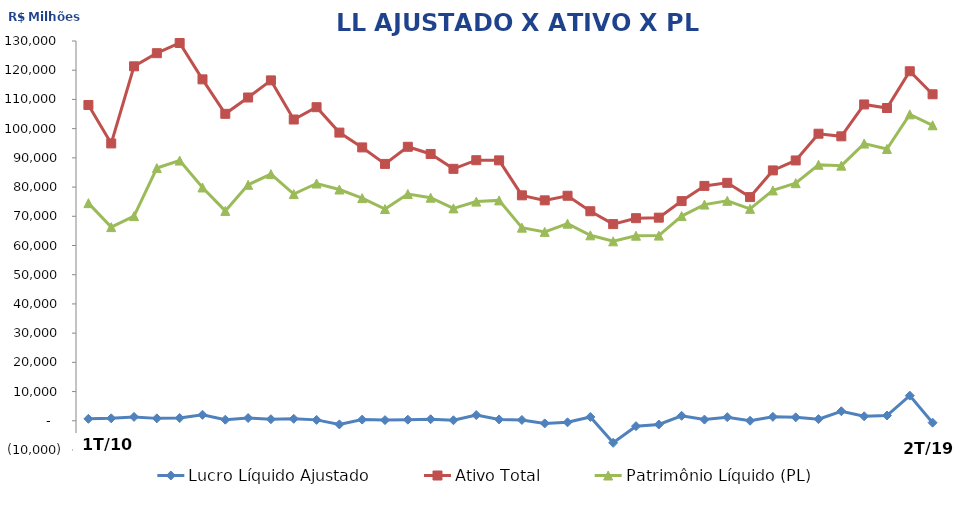
| Category | Lucro Líquido Ajustado | Ativo Total | Patrimônio Líquido (PL) |
|---|---|---|---|
| 1T/10 | 673 | 108093.421 | 74503.724 |
| 2T/10 | 846 | 94936.534 | 66293.03 |
| 3T/10 | 1324 | 121334.614 | 70052.452 |
| 4T/10 | 826 | 125823.422 | 86501.946 |
| 1T/11 | 941.311 | 129324.467 | 89063.946 |
| 2T/11 | 2050 | 116872.822 | 79860.461 |
| 3T/11 | 370.881 | 105073.235 | 71838.42 |
| 4T/11 | 944.308 | 110658.283 | 80770.64 |
| 1T/12 | 538 | 116516.817 | 84433.203 |
| 2T/12 | 684 | 103124.469 | 77598.195 |
| 3T/12 | 312 | 107340.107 | 81224.202 |
| 4T/12 | -1236 | 98642.314 | 79154.143 |
| 1T/13 | 409.127 | 93574.909 | 76208 |
| 2T/13 | 228.061 | 87925.872 | 72486 |
| 3T/13 | 377.39 | 93791.253 | 77620 |
| 4T/13 | 533.986 | 91331.207 | 76353 |
| 1T/14 | 180.891 | 86244.941 | 72703.722 |
| 2T/14 | 1968.387 | 89197.242 | 75023.402 |
| 3T/14 | 467.653 | 89141.003 | 75437.224 |
| 4T/14 | 287.916 | 77169.188 | 66109.273 |
| 1T/15 | -891.973 | 75454.992 | 64658.899 |
| 2T/15 | -519.167 | 77024.885 | 67463.686 |
| 3T/15 | 1314.23 | 71723.908 | 63484.233 |
| 4T/15 | -7544.683 | 67328.198 | 61433.25 |
| 1T/16 | -1844.43 | 69351.362 | 63354.957 |
| 2T/16 | -1275.998 | 69529.929 | 63388.144 |
| 3T/16 | 1705.152 | 75196.207 | 70066.902 |
| 4T/16 | 412.309 | 80399.223 | 74006.012 |
| 1T/17 | 1240.976 | 81455.817 | 75281.681 |
| 2T/17 | 9 | 76568.354 | 72539.43 |
| 3T/17 | 1340 | 85703.74 | 78856.372 |
| 4T/17 | 1188 | 89114.324 | 81330.128 |
| 1T/18 | 570 | 98263.729 | 87644.424 |
| 2T/18 | 3267 | 97367.936 | 87333.925 |
| 3T/18 | 1550 | 108281.599 | 94897.034 |
| 4T/18 | 1807 | 107064.891 | 93046.003 |
| 1T/19 | 8610 | 119643.535 | 104892.758 |
| 2T/19 | -646.866 | 111765.434 | 101146.412 |